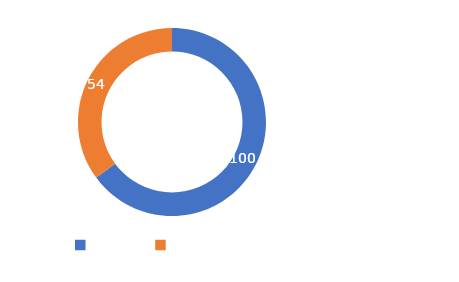
| Category | Series 0 |
|---|---|
| META  | 100 |
| CUMPLIMIENTO | 54 |